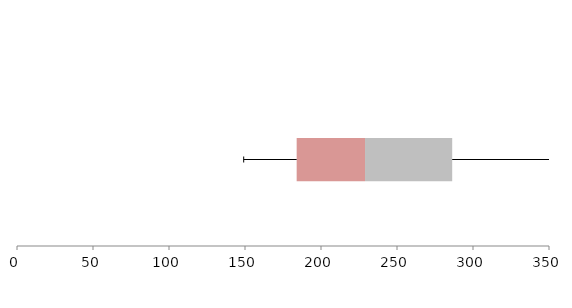
| Category | Series 1 | Series 2 | Series 3 |
|---|---|---|---|
| 0 | 183.992 | 44.975 | 57.344 |